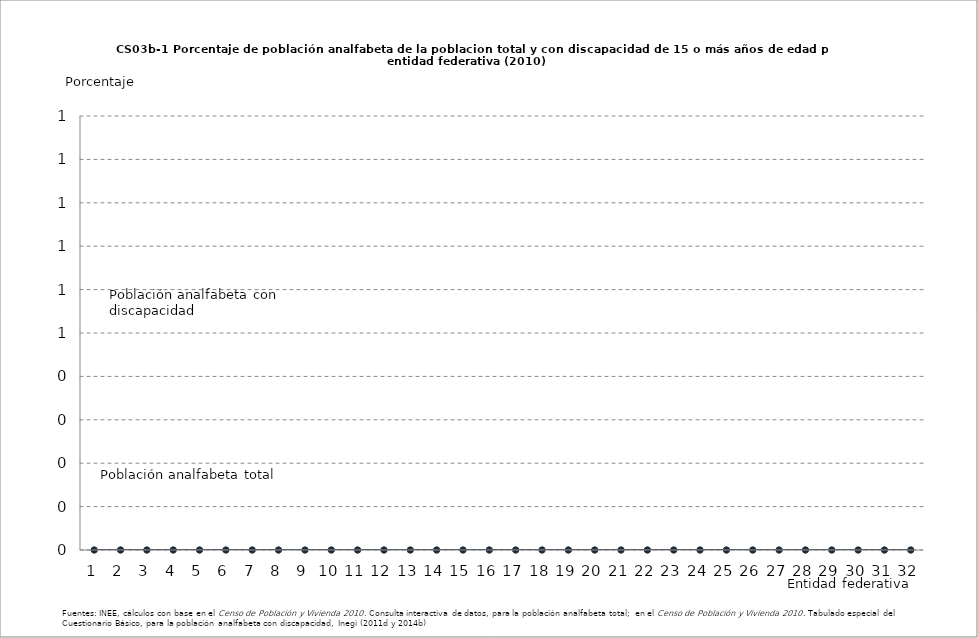
| Category | Series 0 | Series 1 | Series 2 | Series 3 |
|---|---|---|---|---|
| 0 | 0 | 0 | 0 | 0 |
| 1 | 0 | 0 | 0 | 0 |
| 2 | 0 | 0 | 0 | 0 |
| 3 | 0 | 0 | 0 | 0 |
| 4 | 0 | 0 | 0 | 0 |
| 5 | 0 | 0 | 0 | 0 |
| 6 | 0 | 0 | 0 | 0 |
| 7 | 0 | 0 | 0 | 0 |
| 8 | 0 | 0 | 0 | 0 |
| 9 | 0 | 0 | 0 | 0 |
| 10 | 0 | 0 | 0 | 0 |
| 11 | 0 | 0 | 0 | 0 |
| 12 | 0 | 0 | 0 | 0 |
| 13 | 0 | 0 | 0 | 0 |
| 14 | 0 | 0 | 0 | 0 |
| 15 | 0 | 0 | 0 | 0 |
| 16 | 0 | 0 | 0 | 0 |
| 17 | 0 | 0 | 0 | 0 |
| 18 | 0 | 0 | 0 | 0 |
| 19 | 0 | 0 | 0 | 0 |
| 20 | 0 | 0 | 0 | 0 |
| 21 | 0 | 0 | 0 | 0 |
| 22 | 0 | 0 | 0 | 0 |
| 23 | 0 | 0 | 0 | 0 |
| 24 | 0 | 0 | 0 | 0 |
| 25 | 0 | 0 | 0 | 0 |
| 26 | 0 | 0 | 0 | 0 |
| 27 | 0 | 0 | 0 | 0 |
| 28 | 0 | 0 | 0 | 0 |
| 29 | 0 | 0 | 0 | 0 |
| 30 | 0 | 0 | 0 | 0 |
| 31 | 0 | 0 | 0 | 0 |